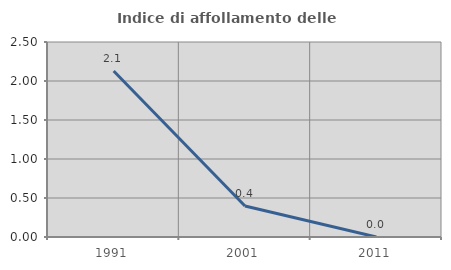
| Category | Indice di affollamento delle abitazioni  |
|---|---|
| 1991.0 | 2.128 |
| 2001.0 | 0.398 |
| 2011.0 | 0 |